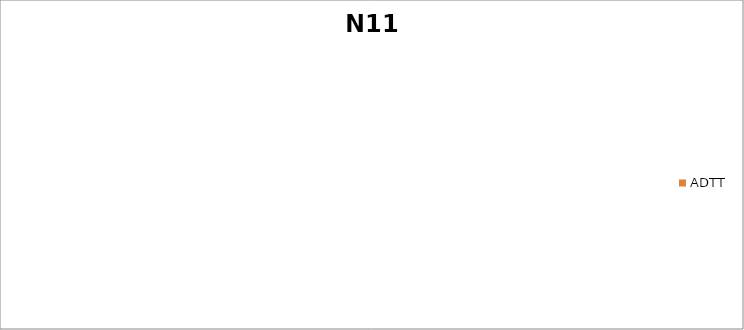
| Category | ADTT |
|---|---|
| T35(Between R573 and R025) | 745.149 |
| T34(Between R033 and R573) | 342.693 |
| S33(Between R519 and R033) | 301.446 |
| Potgietersrus(Between Roedtan and Potgietersrus) | 147.838 |
| Witvinger(Between Mokopane & Gilead) | 414.431 |
| S31(Between R561 and R572) | 149.021 |
| T32(Between R572 and Botswana Border) | 248.333 |